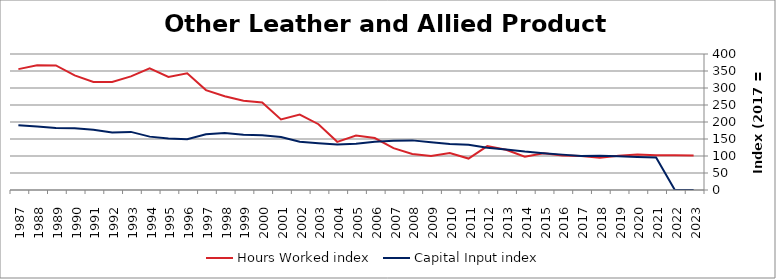
| Category | Hours Worked index | Capital Input index |
|---|---|---|
| 2023.0 | 101.728 | 0 |
| 2022.0 | 102.249 | 0 |
| 2021.0 | 102.439 | 95.341 |
| 2020.0 | 104.279 | 96.825 |
| 2019.0 | 101.014 | 98.964 |
| 2018.0 | 95.136 | 100.836 |
| 2017.0 | 100 | 100 |
| 2016.0 | 101.559 | 104.048 |
| 2015.0 | 107.786 | 108.207 |
| 2014.0 | 98.015 | 112.894 |
| 2013.0 | 118.135 | 119.222 |
| 2012.0 | 129.148 | 124.536 |
| 2011.0 | 92.504 | 133.239 |
| 2010.0 | 108.588 | 135.132 |
| 2009.0 | 99.943 | 140.437 |
| 2008.0 | 105.83 | 145.949 |
| 2007.0 | 123.004 | 145.107 |
| 2006.0 | 152.805 | 141.634 |
| 2005.0 | 160.272 | 135.788 |
| 2004.0 | 141.668 | 133.929 |
| 2003.0 | 193.435 | 137.223 |
| 2002.0 | 221.89 | 141.644 |
| 2001.0 | 207.729 | 155.934 |
| 2000.0 | 257.125 | 161.027 |
| 1999.0 | 262.566 | 162.711 |
| 1998.0 | 275.624 | 167.442 |
| 1997.0 | 293.775 | 163.827 |
| 1996.0 | 343.282 | 149.468 |
| 1995.0 | 332.33 | 151.249 |
| 1994.0 | 357.748 | 156.995 |
| 1993.0 | 334.034 | 170.903 |
| 1992.0 | 317.468 | 169.477 |
| 1991.0 | 317.815 | 177.45 |
| 1990.0 | 337.183 | 181.932 |
| 1989.0 | 366.432 | 182.366 |
| 1988.0 | 366.78 | 186.759 |
| 1987.0 | 355.483 | 190.75 |